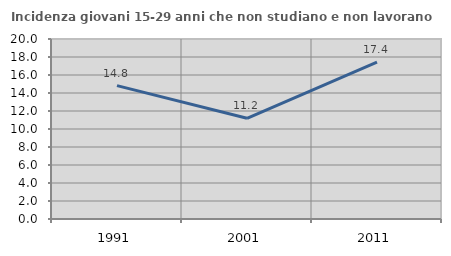
| Category | Incidenza giovani 15-29 anni che non studiano e non lavorano  |
|---|---|
| 1991.0 | 14.823 |
| 2001.0 | 11.194 |
| 2011.0 | 17.433 |